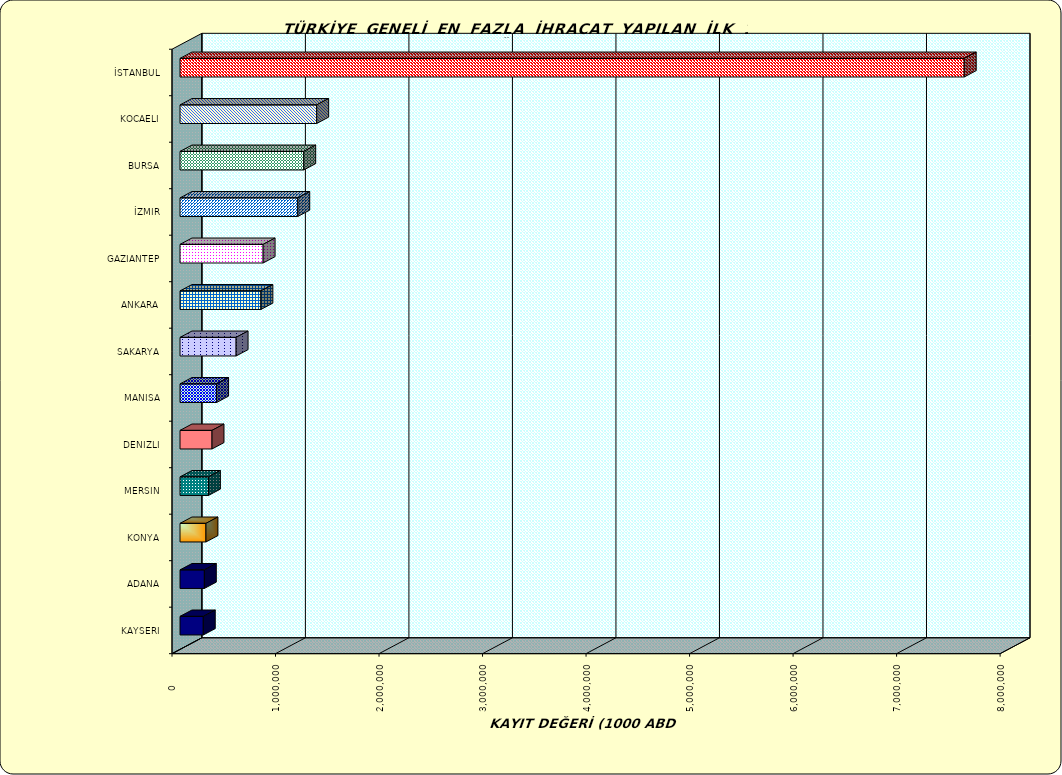
| Category | Series 0 |
|---|---|
| İSTANBUL | 7576002.774 |
| KOCAELI | 1320275.02 |
| BURSA | 1195093.842 |
| İZMIR | 1137463.586 |
| GAZIANTEP | 802846.917 |
| ANKARA | 781318.08 |
| SAKARYA | 541875.868 |
| MANISA | 353511.304 |
| DENIZLI | 309089.742 |
| MERSIN | 274441.483 |
| KONYA | 250621.624 |
| ADANA | 235166.244 |
| KAYSERI | 224747.555 |